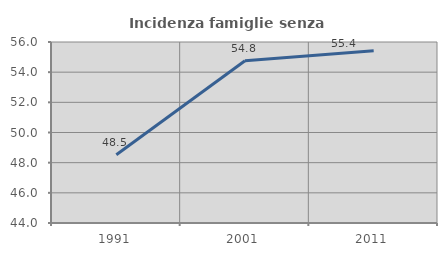
| Category | Incidenza famiglie senza nuclei |
|---|---|
| 1991.0 | 48.521 |
| 2001.0 | 54.762 |
| 2011.0 | 55.414 |